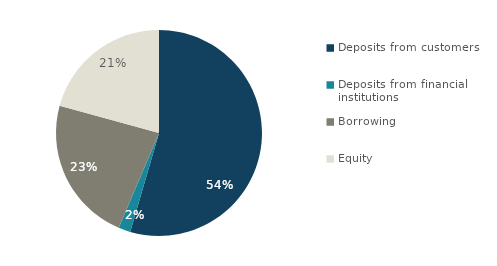
| Category | Series 0 |
|---|---|
| Deposits from customers | 638781 |
| Deposits from financial institutions | 21946 |
| Borrowing | 267853 |
| Equity | 243132 |